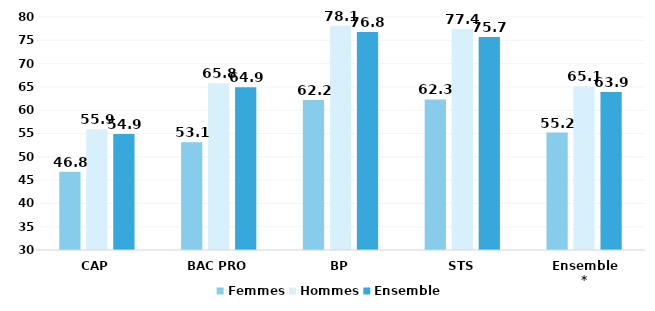
| Category | Femmes | Hommes | Ensemble |
|---|---|---|---|
| CAP | 46.8 | 55.9 | 54.9 |
| BAC PRO | 53.1 | 65.8 | 64.9 |
| BP | 62.2 | 78.1 | 76.8 |
| STS | 62.3 | 77.4 | 75.7 |
| Ensemble* | 55.2 | 65.1 | 63.9 |